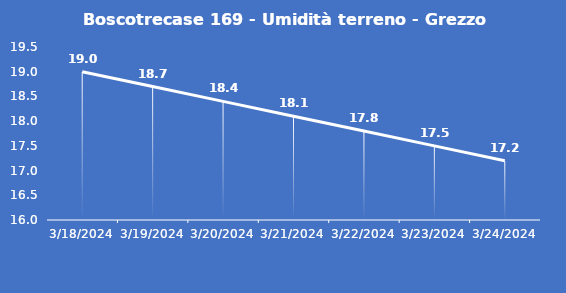
| Category | Boscotrecase 169 - Umidità terreno - Grezzo (%VWC) |
|---|---|
| 3/18/24 | 19 |
| 3/19/24 | 18.7 |
| 3/20/24 | 18.4 |
| 3/21/24 | 18.1 |
| 3/22/24 | 17.8 |
| 3/23/24 | 17.5 |
| 3/24/24 | 17.2 |